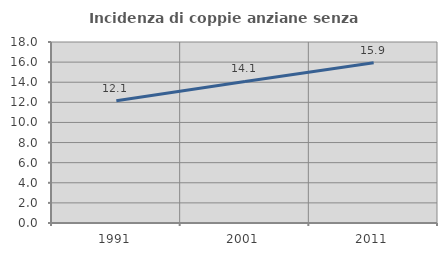
| Category | Incidenza di coppie anziane senza figli  |
|---|---|
| 1991.0 | 12.15 |
| 2001.0 | 14.077 |
| 2011.0 | 15.929 |